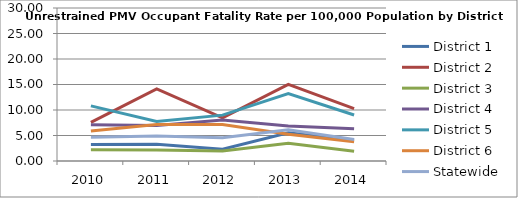
| Category | District 1 | District 2 | District 3 | District 4 | District 5 | District 6 | Statewide |
|---|---|---|---|---|---|---|---|
| 2010.0 | 3.253 | 7.589 | 2.187 | 7.129 | 10.808 | 5.868 | 4.68 |
| 2011.0 | 3.262 | 14.122 | 2.141 | 6.951 | 7.769 | 7.167 | 4.921 |
| 2012.0 | 2.321 | 8.451 | 1.971 | 8.014 | 8.996 | 7.159 | 4.575 |
| 2013.0 | 5.516 | 15.011 | 3.46 | 6.883 | 13.242 | 5.224 | 6.141 |
| 2014.0 | 4.065 | 10.277 | 1.899 | 6.299 | 9.024 | 3.769 | 4.222 |